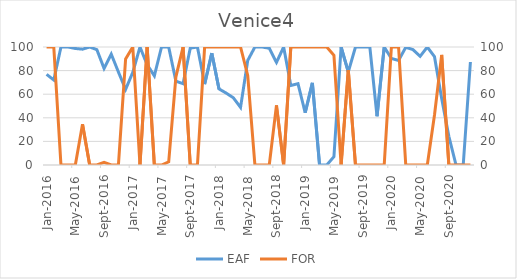
| Category | EAF |
|---|---|
| 2016-01-01 | 76.82 |
| 2016-02-01 | 72.05 |
| 2016-03-01 | 100 |
| 2016-04-01 | 100 |
| 2016-05-01 | 98.73 |
| 2016-06-01 | 98.16 |
| 2016-07-01 | 100 |
| 2016-08-01 | 97.72 |
| 2016-09-01 | 81.84 |
| 2016-10-01 | 93.95 |
| 2016-11-01 | 78.78 |
| 2016-12-01 | 64.07 |
| 2017-01-01 | 78.53 |
| 2017-02-01 | 100 |
| 2017-03-01 | 84.99 |
| 2017-04-01 | 75.56 |
| 2017-05-01 | 100 |
| 2017-06-01 | 99.89 |
| 2017-07-01 | 71.04 |
| 2017-08-01 | 68.91 |
| 2017-09-01 | 99.04 |
| 2017-10-01 | 100 |
| 2017-11-01 | 68.59 |
| 2017-12-01 | 94.75 |
| 2018-01-01 | 64.5 |
| 2018-02-01 | 60.94 |
| 2018-03-01 | 56.97 |
| 2018-04-01 | 48.81 |
| 2018-05-01 | 88.58 |
| 2018-06-01 | 100 |
| 2018-07-01 | 100 |
| 2018-08-01 | 98.93 |
| 2018-09-01 | 86.93 |
| 2018-10-01 | 100 |
| 2018-11-01 | 67.39 |
| 2018-12-01 | 68.9 |
| 2019-01-01 | 44.27 |
| 2019-02-01 | 69.6 |
| 2019-03-01 | 0 |
| 2019-04-01 | 0 |
| 2019-05-01 | 6.99 |
| 2019-06-01 | 100 |
| 2019-07-01 | 78.86 |
| 2019-08-01 | 100 |
| 2019-09-01 | 100 |
| 2019-10-01 | 100 |
| 2019-11-01 | 41.33 |
| 2019-12-01 | 100 |
| 2020-01-01 | 90.22 |
| 2020-02-01 | 88.51 |
| 2020-03-01 | 99.76 |
| 2020-04-01 | 97.78 |
| 2020-05-01 | 92.07 |
| 2020-06-01 | 100 |
| 2020-07-01 | 91.8 |
| 2020-08-01 | 56.42 |
| 2020-09-01 | 24.31 |
| 2020-10-01 | 0 |
| 2020-11-01 | 0 |
| 2020-12-01 | 87.28 |